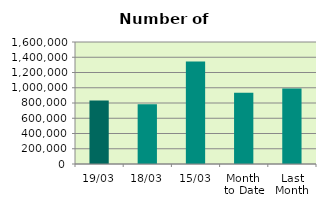
| Category | Series 0 |
|---|---|
| 19/03 | 833346 |
| 18/03 | 784412 |
| 15/03 | 1345192 |
| Month 
to Date | 933287.077 |
| Last
Month | 989849.1 |